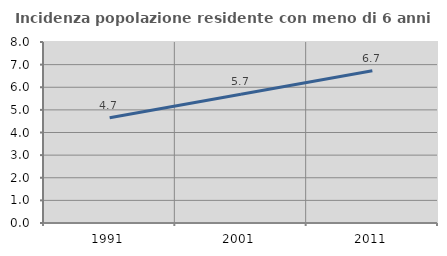
| Category | Incidenza popolazione residente con meno di 6 anni |
|---|---|
| 1991.0 | 4.655 |
| 2001.0 | 5.69 |
| 2011.0 | 6.733 |